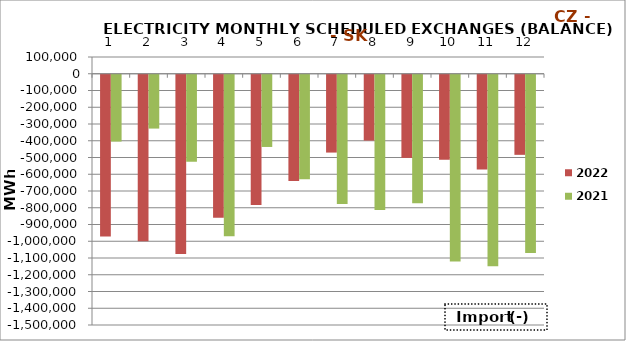
| Category | 2022 | 2021 |
|---|---|---|
| 0 | -966359 | -398975.6 |
| 1 | -993646.5 | -321378.5 |
| 2 | -1069792.1 | -519391.9 |
| 3 | -854149.8 | -964622.9 |
| 4 | -778070.6 | -431146 |
| 5 | -634260.3 | -623404.6 |
| 6 | -464594.5 | -772030.3 |
| 7 | -393179.6 | -808044.4 |
| 8 | -496463.8 | -766486.3 |
| 9 | -507720.8 | -1114676.8 |
| 10 | -565897.8 | -1143632.8 |
| 11 | -478103.2 | -1063592.5 |